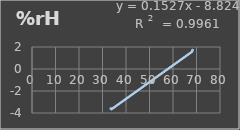
| Category | Humedad |
|---|---|
| 33.6 | -3.6 |
| 51.2 | -1.2 |
| 68.3 | 1.7 |